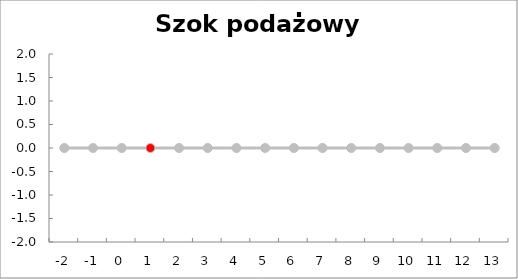
| Category | Series 1 | Szok podażowy v |
|---|---|---|
| -2.0 | 0 | 0 |
| -1.0 | 0 | 0 |
| 0.0 | 0 | 0 |
| 1.0 | 0 | 0 |
| 2.0 | 0 | 0 |
| 3.0 | 0 | 0 |
| 4.0 | 0 | 0 |
| 5.0 | 0 | 0 |
| 6.0 | 0 | 0 |
| 7.0 | 0 | 0 |
| 8.0 | 0 | 0 |
| 9.0 | 0 | 0 |
| 10.0 | 0 | 0 |
| 11.0 | 0 | 0 |
| 12.0 | 0 | 0 |
| 13.0 | 0 | 0 |